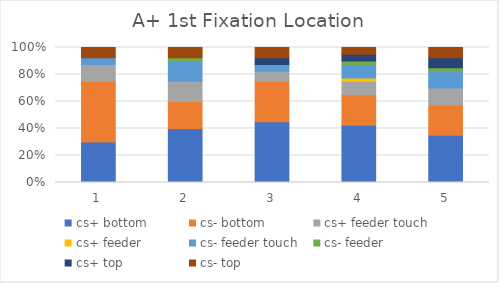
| Category | cs+ bottom | cs- bottom | cs+ feeder touch | cs+ feeder | cs- feeder touch | cs- feeder | cs+ top | cs- top |
|---|---|---|---|---|---|---|---|---|
| 0 | 12 | 18 | 5 | 0 | 2 | 0 | 0 | 3 |
| 1 | 16 | 8 | 6 | 0 | 6 | 1 | 0 | 3 |
| 2 | 18 | 12 | 3 | 0 | 2 | 0 | 2 | 3 |
| 3 | 17 | 9 | 4 | 1 | 4 | 1 | 2 | 2 |
| 4 | 14 | 9 | 5 | 0 | 5 | 1 | 3 | 3 |